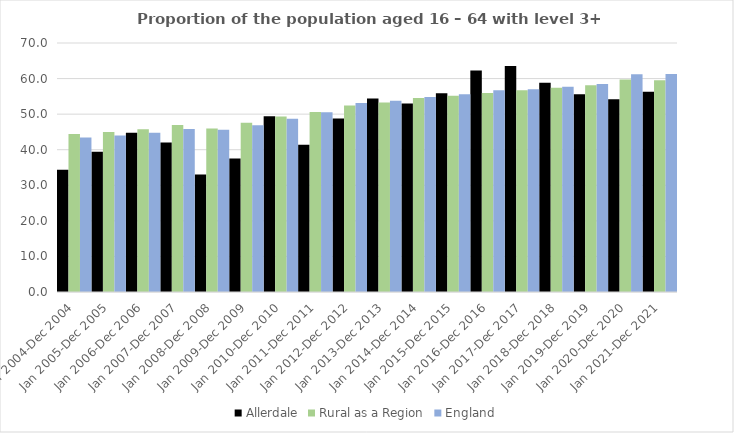
| Category | Allerdale | Rural as a Region | England |
|---|---|---|---|
| Jan 2004-Dec 2004 | 34.4 | 44.405 | 43.4 |
| Jan 2005-Dec 2005 | 39.4 | 44.973 | 44 |
| Jan 2006-Dec 2006 | 44.8 | 45.774 | 44.8 |
| Jan 2007-Dec 2007 | 42 | 46.968 | 45.8 |
| Jan 2008-Dec 2008 | 33 | 45.964 | 45.6 |
| Jan 2009-Dec 2009 | 37.5 | 47.59 | 46.9 |
| Jan 2010-Dec 2010 | 49.4 | 49.362 | 48.7 |
| Jan 2011-Dec 2011 | 41.4 | 50.602 | 50.5 |
| Jan 2012-Dec 2012 | 48.8 | 52.439 | 53.1 |
| Jan 2013-Dec 2013 | 54.4 | 53.276 | 53.8 |
| Jan 2014-Dec 2014 | 53 | 54.57 | 54.8 |
| Jan 2015-Dec 2015 | 55.9 | 55.16 | 55.6 |
| Jan 2016-Dec 2016 | 62.3 | 55.941 | 56.7 |
| Jan 2017-Dec 2017 | 63.5 | 56.689 | 57 |
| Jan 2018-Dec 2018 | 58.8 | 57.389 | 57.7 |
| Jan 2019-Dec 2019 | 55.6 | 58.147 | 58.5 |
| Jan 2020-Dec 2020 | 54.2 | 59.771 | 61.2 |
| Jan 2021-Dec 2021 | 56.3 | 59.54 | 61.3 |